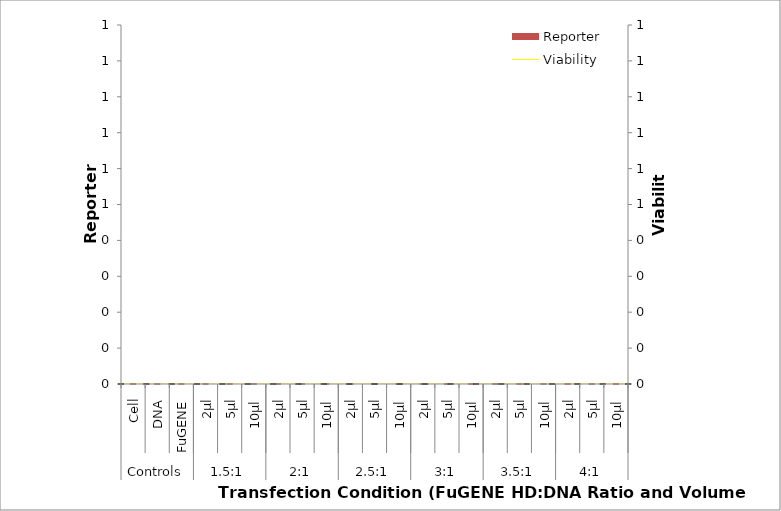
| Category | Reporter |
|---|---|
| 0 | 0 |
| 1 | 0 |
| 2 | 0 |
| 3 | 0 |
| 4 | 0 |
| 5 | 0 |
| 6 | 0 |
| 7 | 0 |
| 8 | 0 |
| 9 | 0 |
| 10 | 0 |
| 11 | 0 |
| 12 | 0 |
| 13 | 0 |
| 14 | 0 |
| 15 | 0 |
| 16 | 0 |
| 17 | 0 |
| 18 | 0 |
| 19 | 0 |
| 20 | 0 |